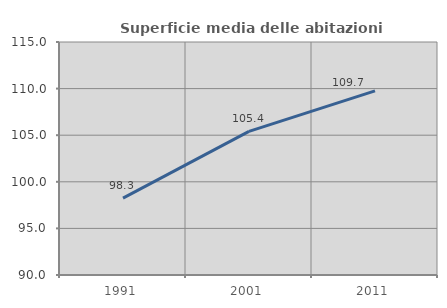
| Category | Superficie media delle abitazioni occupate |
|---|---|
| 1991.0 | 98.253 |
| 2001.0 | 105.409 |
| 2011.0 | 109.748 |